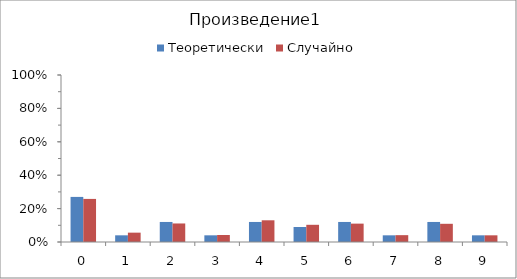
| Category | Теоретически | Случайно |
|---|---|---|
| 0.0 | 0.27 | 0.258 |
| 1.0 | 0.04 | 0.056 |
| 2.0 | 0.12 | 0.111 |
| 3.0 | 0.04 | 0.042 |
| 4.0 | 0.12 | 0.13 |
| 5.0 | 0.09 | 0.103 |
| 6.0 | 0.12 | 0.11 |
| 7.0 | 0.04 | 0.041 |
| 8.0 | 0.12 | 0.109 |
| 9.0 | 0.04 | 0.04 |